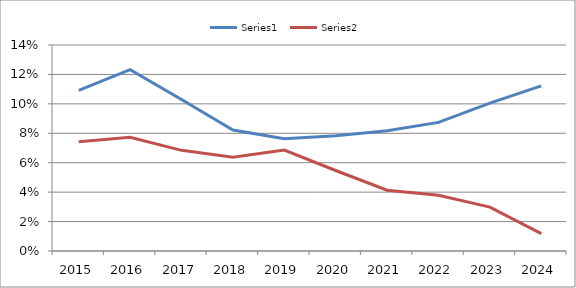
| Category | Series 0 | Series 1 |
|---|---|---|
| 2015.0 | 0.109 | 0.074 |
| 2016.0 | 0.123 | 0.077 |
| 2017.0 | 0.103 | 0.068 |
| 2018.0 | 0.082 | 0.064 |
| 2019.0 | 0.076 | 0.069 |
| 2020.0 | 0.078 | 0.055 |
| 2021.0 | 0.082 | 0.041 |
| 2022.0 | 0.087 | 0.038 |
| 2023.0 | 0.1 | 0.03 |
| 2024.0 | 0.112 | 0.012 |